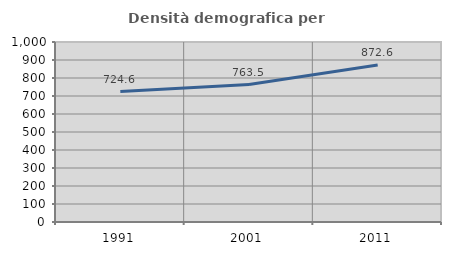
| Category | Densità demografica |
|---|---|
| 1991.0 | 724.622 |
| 2001.0 | 763.523 |
| 2011.0 | 872.639 |